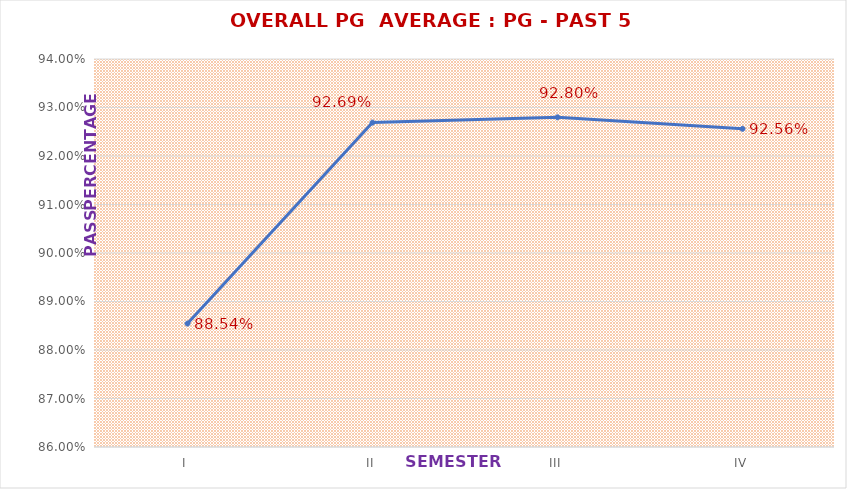
| Category | OVERALL PG  |
|---|---|
| I | 0.885 |
| II | 0.927 |
| III | 0.928 |
| IV | 0.926 |